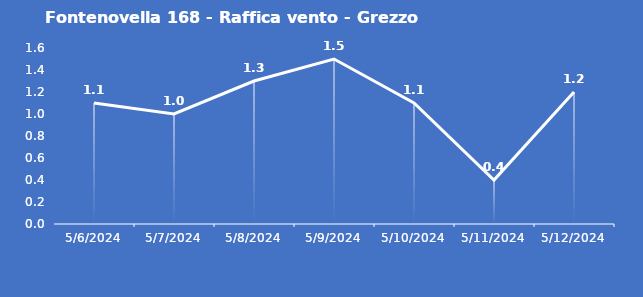
| Category | Fontenovella 168 - Raffica vento - Grezzo (m/s) |
|---|---|
| 5/6/24 | 1.1 |
| 5/7/24 | 1 |
| 5/8/24 | 1.3 |
| 5/9/24 | 1.5 |
| 5/10/24 | 1.1 |
| 5/11/24 | 0.4 |
| 5/12/24 | 1.2 |